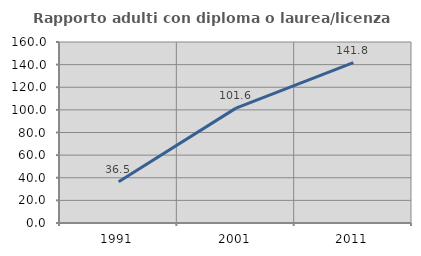
| Category | Rapporto adulti con diploma o laurea/licenza media  |
|---|---|
| 1991.0 | 36.508 |
| 2001.0 | 101.562 |
| 2011.0 | 141.818 |